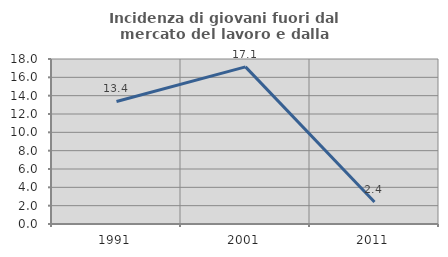
| Category | Incidenza di giovani fuori dal mercato del lavoro e dalla formazione  |
|---|---|
| 1991.0 | 13.369 |
| 2001.0 | 17.143 |
| 2011.0 | 2.4 |